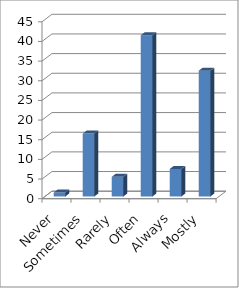
| Category | Series 0 |
|---|---|
| Never | 1 |
| Sometimes | 16 |
| Rarely | 5 |
| Often | 41 |
| Always | 7 |
| Mostly | 32 |